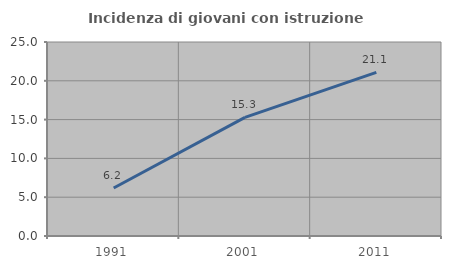
| Category | Incidenza di giovani con istruzione universitaria |
|---|---|
| 1991.0 | 6.186 |
| 2001.0 | 15.294 |
| 2011.0 | 21.078 |